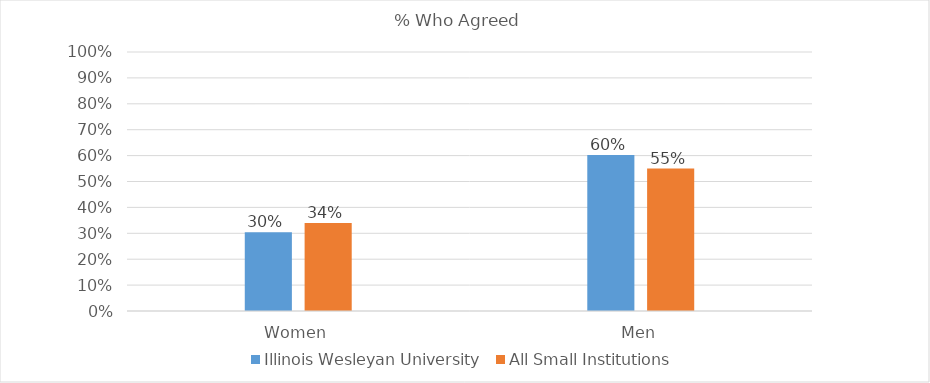
| Category | Illinois Wesleyan University | All Small Institutions |
|---|---|---|
| Women | 0.304 | 0.34 |
| Men | 0.602 | 0.55 |